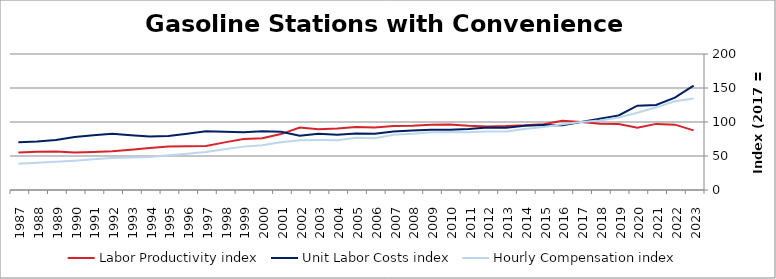
| Category | Labor Productivity index | Unit Labor Costs index | Hourly Compensation index |
|---|---|---|---|
| 2023.0 | 87.692 | 153.569 | 134.667 |
| 2022.0 | 96.109 | 135.825 | 130.54 |
| 2021.0 | 97.216 | 125.052 | 121.571 |
| 2020.0 | 91.487 | 124.064 | 113.502 |
| 2019.0 | 97.197 | 109.622 | 106.55 |
| 2018.0 | 97.575 | 104.666 | 102.128 |
| 2017.0 | 100 | 100 | 100 |
| 2016.0 | 101.767 | 95.045 | 96.724 |
| 2015.0 | 96.817 | 95.764 | 92.716 |
| 2014.0 | 95.098 | 94.412 | 89.783 |
| 2013.0 | 94.002 | 91.594 | 86.101 |
| 2012.0 | 93.542 | 91.992 | 86.051 |
| 2011.0 | 94.624 | 89.84 | 85.01 |
| 2010.0 | 96.497 | 88.463 | 85.364 |
| 2009.0 | 95.867 | 88.639 | 84.976 |
| 2008.0 | 94.356 | 87.586 | 82.642 |
| 2007.0 | 94.258 | 86.079 | 81.137 |
| 2006.0 | 91.909 | 82.714 | 76.021 |
| 2005.0 | 92.578 | 82.948 | 76.792 |
| 2004.0 | 90.329 | 81.183 | 73.332 |
| 2003.0 | 89.177 | 82.541 | 73.608 |
| 2002.0 | 91.837 | 79.795 | 73.281 |
| 2001.0 | 82.219 | 85.599 | 70.379 |
| 2000.0 | 75.961 | 86.564 | 65.755 |
| 1999.0 | 74.969 | 85.086 | 63.788 |
| 1998.0 | 70.014 | 85.517 | 59.873 |
| 1997.0 | 64.748 | 86.243 | 55.84 |
| 1996.0 | 64.244 | 82.862 | 53.234 |
| 1995.0 | 64.139 | 79.539 | 51.016 |
| 1994.0 | 61.836 | 78.772 | 48.709 |
| 1993.0 | 59.268 | 80.471 | 47.694 |
| 1992.0 | 56.958 | 82.536 | 47.011 |
| 1991.0 | 55.983 | 80.594 | 45.119 |
| 1990.0 | 55.218 | 78.103 | 43.127 |
| 1989.0 | 56.591 | 73.453 | 41.568 |
| 1988.0 | 56.157 | 71.311 | 40.046 |
| 1987.0 | 55.194 | 70.203 | 38.748 |